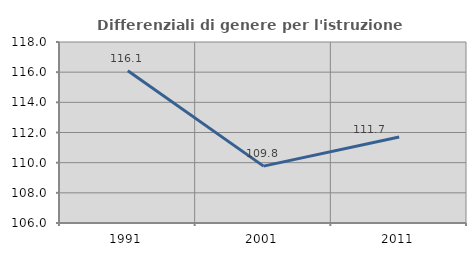
| Category | Differenziali di genere per l'istruzione superiore |
|---|---|
| 1991.0 | 116.097 |
| 2001.0 | 109.771 |
| 2011.0 | 111.706 |